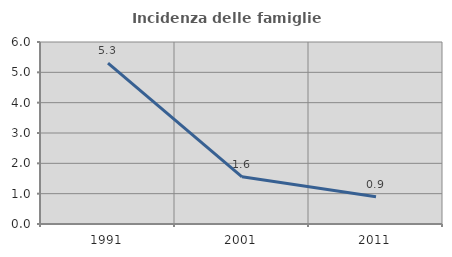
| Category | Incidenza delle famiglie numerose |
|---|---|
| 1991.0 | 5.3 |
| 2001.0 | 1.554 |
| 2011.0 | 0.899 |